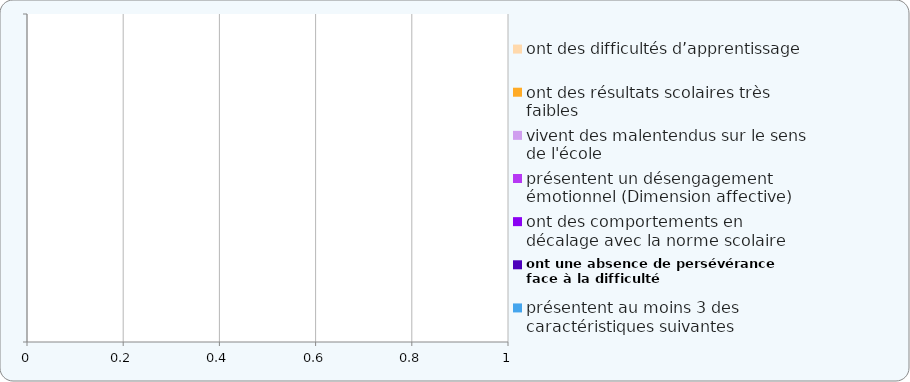
| Category | ont des difficultés d’apprentissage | ont des résultats scolaires très faibles | vivent des malentendus sur le sens de l'école  | présentent un désengagement émotionnel (Dimension affective) | ont des comportements en décalage avec la norme scolaire  | ont une absence de persévérance face à la difficulté | présentent au moins 3 des caractéristiques suivantes |
|---|---|---|---|---|---|---|---|
|  | 0 | 0 | 0 | 0 | 0 | 0 | 0 |